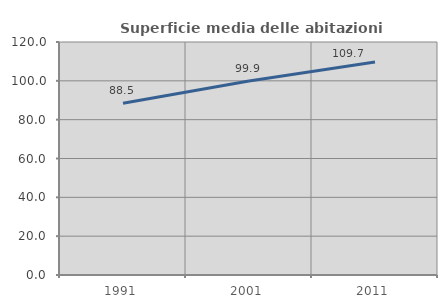
| Category | Superficie media delle abitazioni occupate |
|---|---|
| 1991.0 | 88.486 |
| 2001.0 | 99.939 |
| 2011.0 | 109.746 |